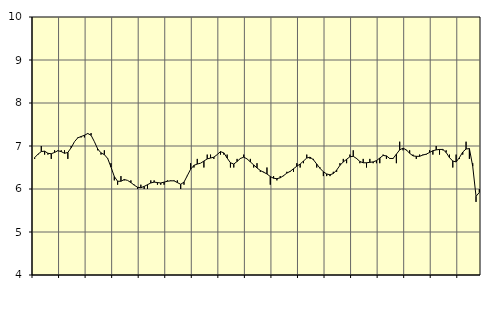
| Category | Piggar | Transport, SNI 49-53 |
|---|---|---|
| nan | 6.7 | 6.73 |
| 87.0 | 6.8 | 6.81 |
| 87.0 | 7 | 6.87 |
| 87.0 | 6.8 | 6.88 |
| nan | 6.8 | 6.83 |
| 88.0 | 6.7 | 6.82 |
| 88.0 | 6.9 | 6.85 |
| 88.0 | 6.9 | 6.89 |
| nan | 6.9 | 6.87 |
| 89.0 | 6.9 | 6.83 |
| 89.0 | 6.7 | 6.85 |
| 89.0 | 7 | 6.96 |
| nan | 7.1 | 7.1 |
| 90.0 | 7.2 | 7.19 |
| 90.0 | 7.2 | 7.22 |
| 90.0 | 7.2 | 7.25 |
| nan | 7.3 | 7.29 |
| 91.0 | 7.3 | 7.25 |
| 91.0 | 7.1 | 7.1 |
| 91.0 | 6.9 | 6.93 |
| nan | 6.8 | 6.84 |
| 92.0 | 6.9 | 6.8 |
| 92.0 | 6.7 | 6.71 |
| 92.0 | 6.6 | 6.51 |
| nan | 6.2 | 6.29 |
| 93.0 | 6.1 | 6.18 |
| 93.0 | 6.3 | 6.18 |
| 93.0 | 6.2 | 6.22 |
| nan | 6.2 | 6.2 |
| 94.0 | 6.2 | 6.15 |
| 94.0 | 6.1 | 6.09 |
| 94.0 | 6 | 6.04 |
| nan | 6.1 | 6.03 |
| 95.0 | 6 | 6.06 |
| 95.0 | 6 | 6.1 |
| 95.0 | 6.2 | 6.14 |
| nan | 6.2 | 6.16 |
| 96.0 | 6.1 | 6.15 |
| 96.0 | 6.1 | 6.14 |
| 96.0 | 6.1 | 6.16 |
| nan | 6.2 | 6.18 |
| 97.0 | 6.2 | 6.19 |
| 97.0 | 6.2 | 6.19 |
| 97.0 | 6.2 | 6.15 |
| nan | 6 | 6.11 |
| 98.0 | 6.1 | 6.16 |
| 98.0 | 6.3 | 6.31 |
| 98.0 | 6.6 | 6.46 |
| nan | 6.5 | 6.55 |
| 99.0 | 6.7 | 6.58 |
| 99.0 | 6.6 | 6.6 |
| 99.0 | 6.5 | 6.65 |
| nan | 6.8 | 6.7 |
| 0.0 | 6.8 | 6.72 |
| 0.0 | 6.7 | 6.74 |
| 0.0 | 6.8 | 6.8 |
| nan | 6.8 | 6.87 |
| 1.0 | 6.8 | 6.84 |
| 1.0 | 6.8 | 6.72 |
| 1.0 | 6.5 | 6.61 |
| nan | 6.5 | 6.58 |
| 2.0 | 6.7 | 6.64 |
| 2.0 | 6.7 | 6.71 |
| 2.0 | 6.8 | 6.74 |
| nan | 6.7 | 6.7 |
| 3.0 | 6.7 | 6.63 |
| 3.0 | 6.5 | 6.56 |
| 3.0 | 6.6 | 6.49 |
| nan | 6.4 | 6.43 |
| 4.0 | 6.4 | 6.39 |
| 4.0 | 6.5 | 6.35 |
| 4.0 | 6.1 | 6.29 |
| nan | 6.3 | 6.25 |
| 5.0 | 6.2 | 6.24 |
| 5.0 | 6.3 | 6.26 |
| 5.0 | 6.3 | 6.31 |
| nan | 6.4 | 6.37 |
| 6.0 | 6.4 | 6.41 |
| 6.0 | 6.4 | 6.47 |
| 6.0 | 6.6 | 6.53 |
| nan | 6.5 | 6.58 |
| 7.0 | 6.6 | 6.65 |
| 7.0 | 6.8 | 6.72 |
| 7.0 | 6.7 | 6.74 |
| nan | 6.7 | 6.68 |
| 8.0 | 6.5 | 6.58 |
| 8.0 | 6.5 | 6.48 |
| 8.0 | 6.3 | 6.4 |
| nan | 6.3 | 6.35 |
| 9.0 | 6.3 | 6.33 |
| 9.0 | 6.4 | 6.36 |
| 9.0 | 6.4 | 6.44 |
| nan | 6.6 | 6.55 |
| 10.0 | 6.7 | 6.63 |
| 10.0 | 6.6 | 6.69 |
| 10.0 | 6.8 | 6.75 |
| nan | 6.9 | 6.76 |
| 11.0 | 6.7 | 6.71 |
| 11.0 | 6.6 | 6.64 |
| 11.0 | 6.7 | 6.61 |
| nan | 6.5 | 6.61 |
| 12.0 | 6.7 | 6.62 |
| 12.0 | 6.6 | 6.63 |
| 12.0 | 6.6 | 6.66 |
| nan | 6.6 | 6.72 |
| 13.0 | 6.8 | 6.78 |
| 13.0 | 6.7 | 6.77 |
| 13.0 | 6.7 | 6.71 |
| nan | 6.7 | 6.71 |
| 14.0 | 6.6 | 6.81 |
| 14.0 | 7.1 | 6.91 |
| 14.0 | 6.9 | 6.95 |
| nan | 6.9 | 6.91 |
| 15.0 | 6.9 | 6.83 |
| 15.0 | 6.8 | 6.77 |
| 15.0 | 6.7 | 6.76 |
| nan | 6.8 | 6.76 |
| 16.0 | 6.8 | 6.79 |
| 16.0 | 6.8 | 6.81 |
| 16.0 | 6.9 | 6.85 |
| nan | 6.8 | 6.89 |
| 17.0 | 7 | 6.91 |
| 17.0 | 6.8 | 6.92 |
| 17.0 | 6.9 | 6.92 |
| nan | 6.9 | 6.85 |
| 18.0 | 6.8 | 6.73 |
| 18.0 | 6.5 | 6.65 |
| 18.0 | 6.8 | 6.63 |
| nan | 6.7 | 6.73 |
| 19.0 | 6.8 | 6.86 |
| 19.0 | 7.1 | 6.93 |
| 19.0 | 6.7 | 6.94 |
| nan | 6.6 | 6.53 |
| 20.0 | 5.7 | 5.83 |
| 20.0 | 6 | 5.92 |